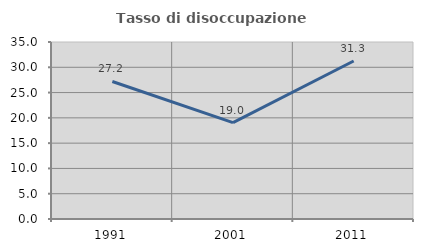
| Category | Tasso di disoccupazione giovanile  |
|---|---|
| 1991.0 | 27.193 |
| 2001.0 | 19.048 |
| 2011.0 | 31.25 |